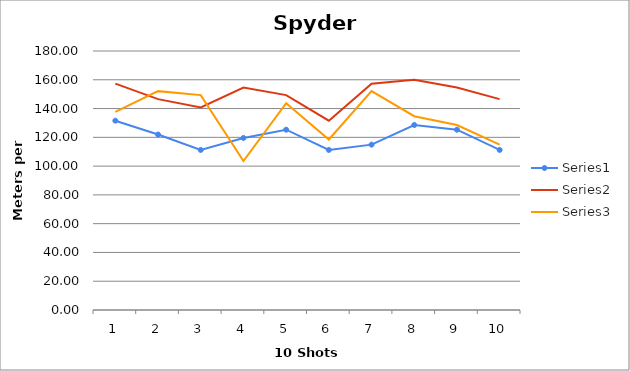
| Category | Series 0 | Series 1 | Series 2 |
|---|---|---|---|
| 0 | 131.577 | 157.312 | 137.755 |
| 1 | 121.939 | 146.533 | 152.104 |
| 2 | 111.237 | 140.741 | 149.344 |
| 3 | 119.571 | 154.646 | 103.489 |
| 4 | 125.303 | 149.344 | 143.666 |
| 5 | 111.237 | 131.577 | 118.479 |
| 6 | 114.915 | 157.312 | 152.104 |
| 7 | 128.58 | 159.934 | 134.701 |
| 8 | 125.303 | 154.646 | 128.58 |
| 9 | 111.237 | 146.533 | 114.915 |